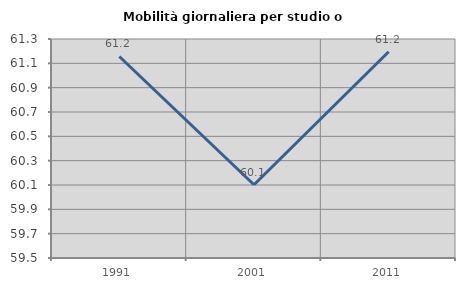
| Category | Mobilità giornaliera per studio o lavoro |
|---|---|
| 1991.0 | 61.156 |
| 2001.0 | 60.102 |
| 2011.0 | 61.195 |